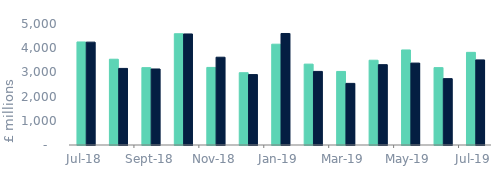
| Category | Full market | Remortgage without equity withdrawn |
|---|---|---|
| 2018-07-01 | 4257.972 | 4250.837 |
| 2018-08-01 | 3544.11 | 3164.571 |
| 2018-09-01 | 3196.659 | 3141.536 |
| 2018-10-01 | 4598.024 | 4589.26 |
| 2018-11-01 | 3205.305 | 3627.525 |
| 2018-12-01 | 2986.944 | 2910.086 |
| 2019-01-01 | 4165.38 | 4607.507 |
| 2019-02-01 | 3342.219 | 3040.458 |
| 2019-03-01 | 3039.677 | 2546.096 |
| 2019-04-01 | 3502.964 | 3319.733 |
| 2019-05-01 | 3927.659 | 3384.831 |
| 2019-06-01 | 3197.801 | 2742.226 |
| 2019-07-01 | 3828.61 | 3516.667 |